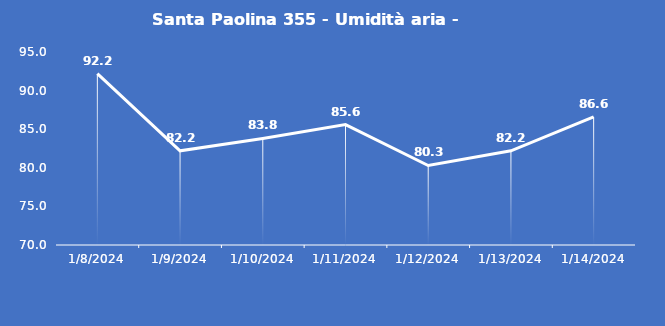
| Category | Santa Paolina 355 - Umidità aria - Grezzo (%) |
|---|---|
| 1/8/24 | 92.2 |
| 1/9/24 | 82.2 |
| 1/10/24 | 83.8 |
| 1/11/24 | 85.6 |
| 1/12/24 | 80.3 |
| 1/13/24 | 82.2 |
| 1/14/24 | 86.6 |